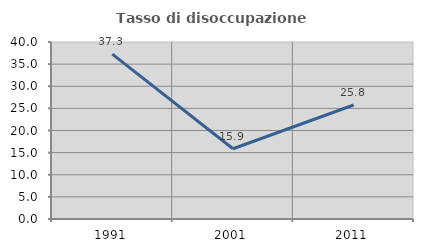
| Category | Tasso di disoccupazione giovanile  |
|---|---|
| 1991.0 | 37.255 |
| 2001.0 | 15.873 |
| 2011.0 | 25.758 |